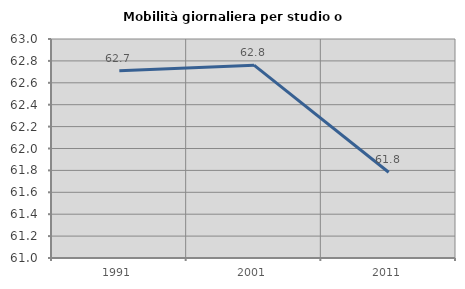
| Category | Mobilità giornaliera per studio o lavoro |
|---|---|
| 1991.0 | 62.709 |
| 2001.0 | 62.761 |
| 2011.0 | 61.783 |